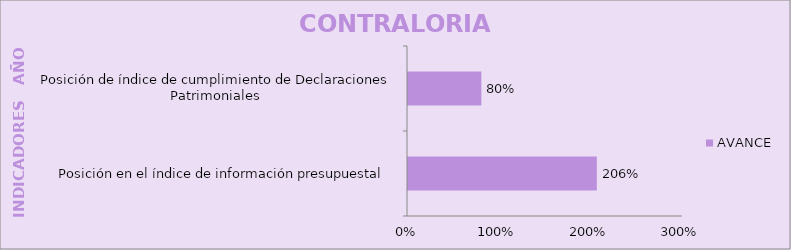
| Category | AVANCE |
|---|---|
| Posición en el índice de información presupuestal  | 2.06 |
| Posición de índice de cumplimiento de Declaraciones Patrimoniales  | 0.8 |